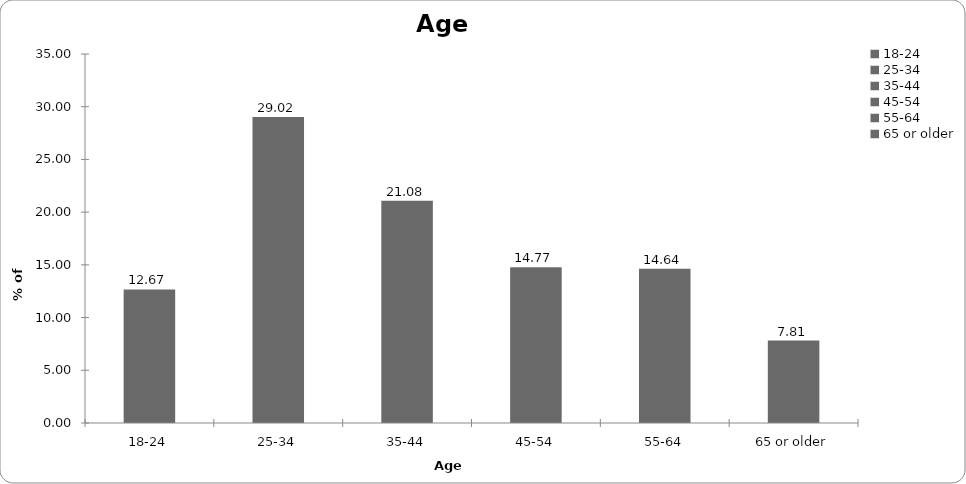
| Category | Age range |
|---|---|
| 18-24 | 12.672 |
| 25-34 | 29.022 |
| 35-44 | 21.077 |
| 45-54 | 14.773 |
| 55-64 | 14.642 |
| 65 or older | 7.814 |